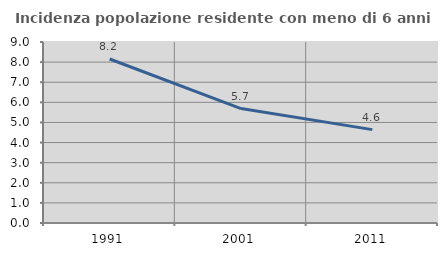
| Category | Incidenza popolazione residente con meno di 6 anni |
|---|---|
| 1991.0 | 8.153 |
| 2001.0 | 5.691 |
| 2011.0 | 4.644 |